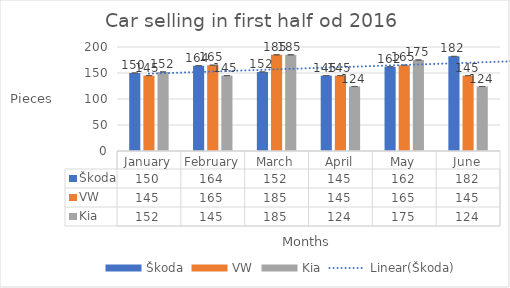
| Category | Škoda | VW | Kia |
|---|---|---|---|
| January | 150 | 145 | 152 |
| February | 164 | 165 | 145 |
| March | 152 | 185 | 185 |
| April | 145 | 145 | 124 |
| May | 162 | 165 | 175 |
| June | 182 | 145 | 124 |